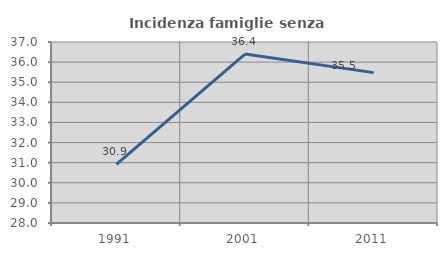
| Category | Incidenza famiglie senza nuclei |
|---|---|
| 1991.0 | 30.917 |
| 2001.0 | 36.401 |
| 2011.0 | 35.477 |